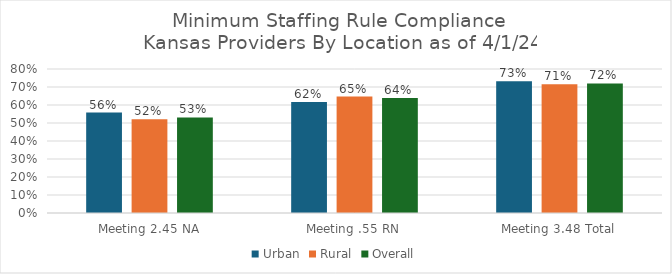
| Category | Urban | Rural | Overall |
|---|---|---|---|
| Meeting 2.45 NA | 0.558 | 0.52 | 0.531 |
| Meeting .55 RN | 0.616 | 0.647 | 0.638 |
| Meeting 3.48 Total | 0.733 | 0.715 | 0.72 |